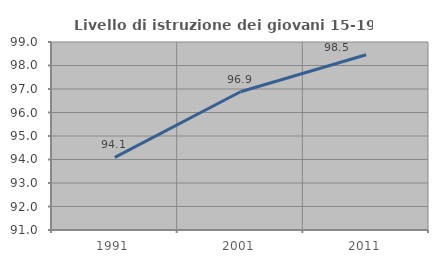
| Category | Livello di istruzione dei giovani 15-19 anni |
|---|---|
| 1991.0 | 94.093 |
| 2001.0 | 96.882 |
| 2011.0 | 98.46 |